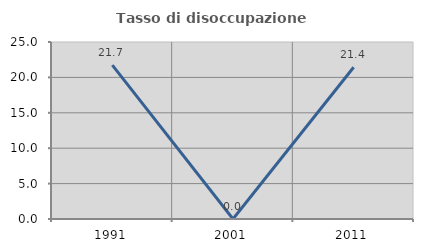
| Category | Tasso di disoccupazione giovanile  |
|---|---|
| 1991.0 | 21.739 |
| 2001.0 | 0 |
| 2011.0 | 21.429 |